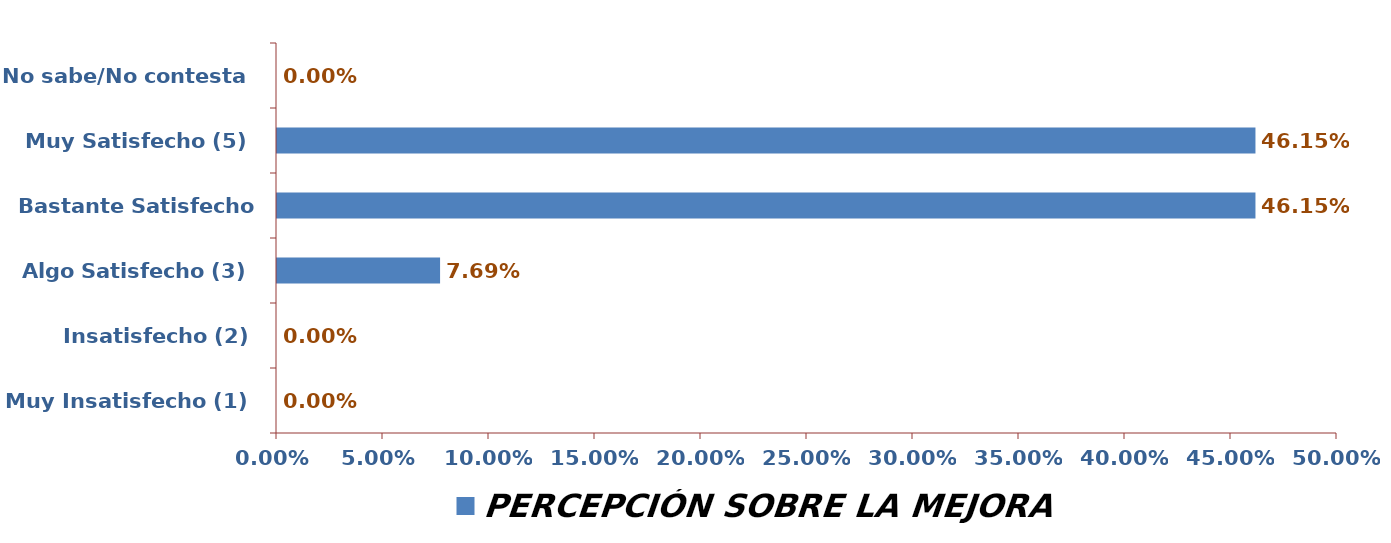
| Category | PERCEPCIÓN SOBRE LA MEJORA |
|---|---|
| Muy Insatisfecho (1) | 0 |
| Insatisfecho (2) | 0 |
| Algo Satisfecho (3) | 0.077 |
| Bastante Satisfecho (4) | 0.462 |
| Muy Satisfecho (5) | 0.462 |
| No sabe/No contesta | 0 |